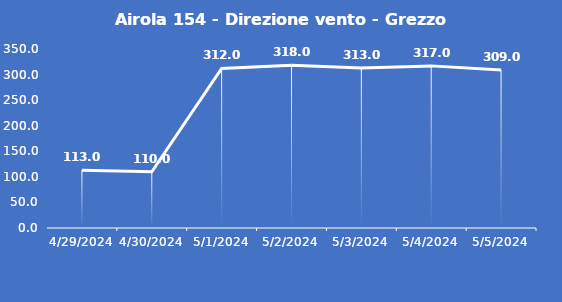
| Category | Airola 154 - Direzione vento - Grezzo (°N) |
|---|---|
| 4/29/24 | 113 |
| 4/30/24 | 110 |
| 5/1/24 | 312 |
| 5/2/24 | 318 |
| 5/3/24 | 313 |
| 5/4/24 | 317 |
| 5/5/24 | 309 |